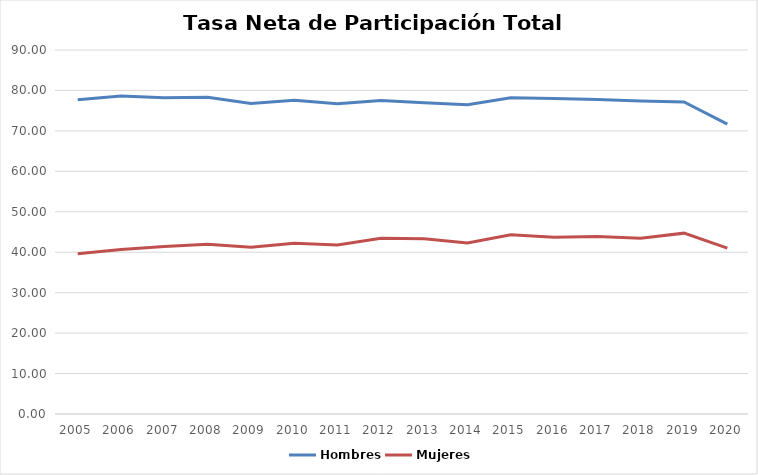
| Category | Hombres | Mujeres |
|---|---|---|
| 2005.0 | 77.693 | 39.605 |
| 2006.0 | 78.656 | 40.693 |
| 2007.0 | 78.19 | 41.413 |
| 2008.0 | 78.289 | 41.989 |
| 2009.0 | 76.753 | 41.219 |
| 2010.0 | 77.582 | 42.215 |
| 2011.0 | 76.718 | 41.782 |
| 2012.0 | 77.51 | 43.469 |
| 2013.0 | 76.948 | 43.342 |
| 2014.0 | 76.438 | 42.309 |
| 2015.0 | 78.186 | 44.327 |
| 2016.0 | 77.985 | 43.684 |
| 2017.0 | 77.784 | 43.898 |
| 2018.0 | 77.382 | 43.469 |
| 2019.0 | 77.165 | 44.715 |
| 2020.0 | 71.681 | 41.031 |